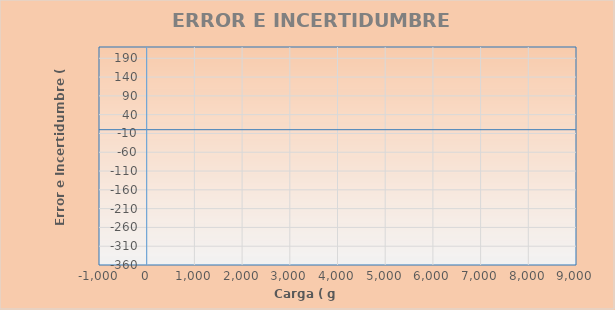
| Category | ERROR (g) |
|---|---|
| #N/A | -0.106 |
| #N/A | 0 |
| #N/A | 0 |
| #N/A | 0 |
| #N/A | 0 |